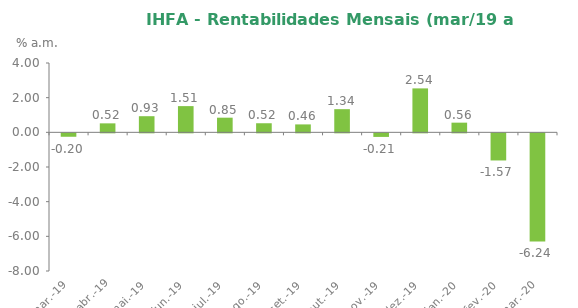
| Category | Series 0 |
|---|---|
| 2019-03-31 | -0.198 |
| 2019-04-30 | 0.518 |
| 2019-05-31 | 0.93 |
| 2019-06-30 | 1.513 |
| 2019-07-31 | 0.845 |
| 2019-08-31 | 0.524 |
| 2019-09-30 | 0.457 |
| 2019-10-31 | 1.337 |
| 2019-11-30 | -0.207 |
| 2019-12-31 | 2.535 |
| 2020-01-31 | 0.558 |
| 2020-02-29 | -1.565 |
| 2020-03-31 | -6.239 |